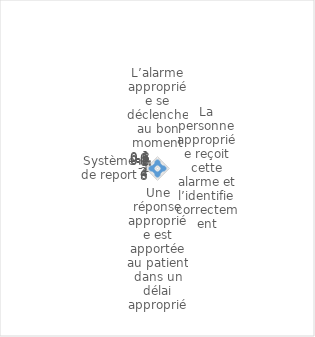
| Category | moyenne |
|---|---|
| L’alarme appropriée se déclenche au bon moment | 0 |
| La personne appropriée reçoit cette alarme et l’identifie correctement | 0 |
| Une réponse appropriée est apportée au patient dans un délai approprié | 0 |
| Système de report | 0 |